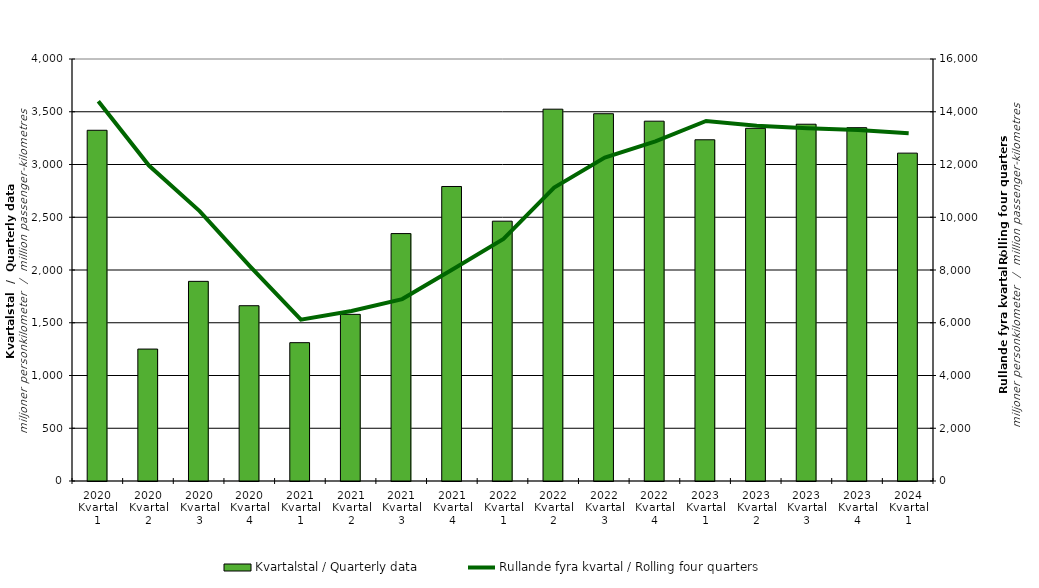
| Category | Kvartalstal / Quarterly data |
|---|---|
| 2020 Kvartal 1 | 3324.383 |
| 2020 Kvartal 2 | 1250.488 |
| 2020 Kvartal 3 | 1892.351 |
| 2020 Kvartal 4 | 1661.523 |
| 2021 Kvartal 1 | 1311.197 |
| 2021 Kvartal 2 | 1579.614 |
| 2021 Kvartal 3 | 2345.169 |
| 2021 Kvartal 4 | 2791.509 |
| 2022 Kvartal 1 | 2462.735 |
| 2022 Kvartal 2 | 3524.434 |
| 2022 Kvartal 3 | 3481.38 |
| 2022 Kvartal 4 | 3410.614 |
| 2023 Kvartal 1 | 3234.431 |
| 2023 Kvartal 2 | 3342.955 |
| 2023 Kvartal 3 | 3381.808 |
| 2023 Kvartal 4 | 3349.146 |
| 2024 Kvartal 1 | 3107.757 |